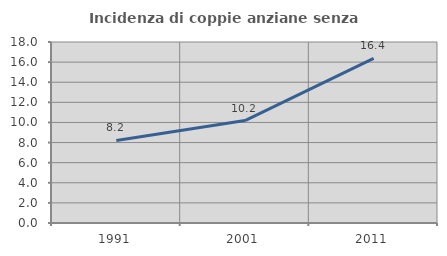
| Category | Incidenza di coppie anziane senza figli  |
|---|---|
| 1991.0 | 8.213 |
| 2001.0 | 10.186 |
| 2011.0 | 16.379 |